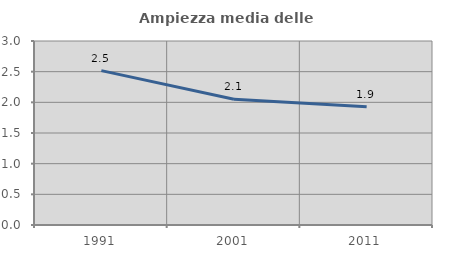
| Category | Ampiezza media delle famiglie |
|---|---|
| 1991.0 | 2.517 |
| 2001.0 | 2.051 |
| 2011.0 | 1.928 |